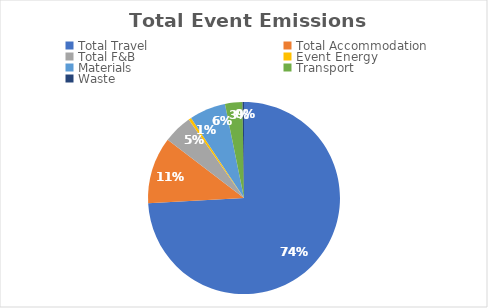
| Category | Series 0 |
|---|---|
| Total Travel | 32.87 |
| Total Accommodation | 4.99 |
| Total F&B | 2.16 |
| Event Energy | 0.21 |
| Materials | 2.71 |
| Transport | 1.3 |
| Waste | 0.11 |